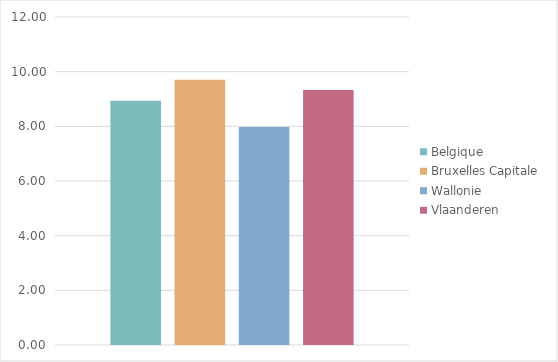
| Category | Belgique | Bruxelles Capitale | Wallonie | Vlaanderen |
|---|---|---|---|---|
| Totaal | 8.939 | 9.705 | 7.973 | 9.329 |